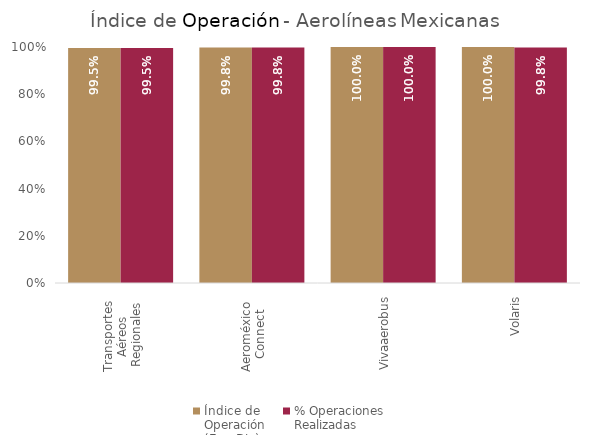
| Category | Índice de 
Operación
(Ene-Dic) | % Operaciones
Realizadas |
|---|---|---|
| Transportes 
Aéreos 
Regionales | 0.995 | 0.995 |
| Aeroméxico 
Connect | 0.998 | 0.998 |
| Vivaaerobus | 1 | 1 |
| Volaris | 1 | 0.998 |